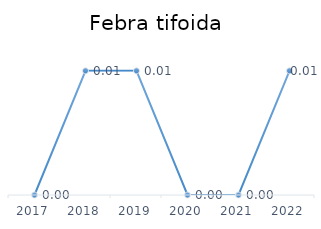
| Category | Series 0 |
|---|---|
| 2017.0 | 0 |
| 2018.0 | 0.01 |
| 2019.0 | 0.01 |
| 2020.0 | 0 |
| 2021.0 | 0 |
| 2022.0 | 0.01 |